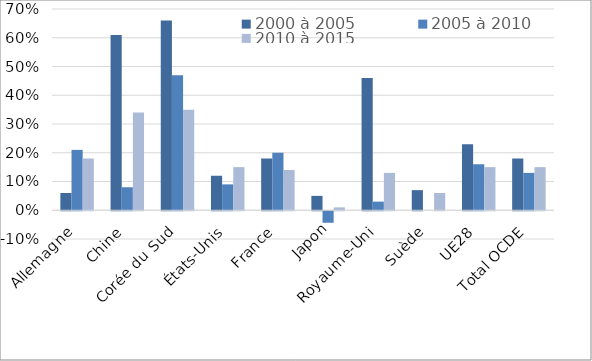
| Category | 2000 à 2005 | 2005 à 2010 | 2010 à 2015 |
|---|---|---|---|
| Allemagne | 0.06 | 0.21 | 0.18 |
| Chine | 0.61 | 0.08 | 0.34 |
| Corée du Sud | 0.66 | 0.47 | 0.35 |
| États-Unis | 0.12 | 0.09 | 0.15 |
| France | 0.18 | 0.2 | 0.14 |
| Japon | 0.05 | -0.04 | 0.01 |
| Royaume-Uni | 0.46 | 0.03 | 0.13 |
| Suède | 0.07 | 0 | 0.06 |
| UE28 | 0.23 | 0.16 | 0.15 |
| Total OCDE | 0.18 | 0.13 | 0.15 |